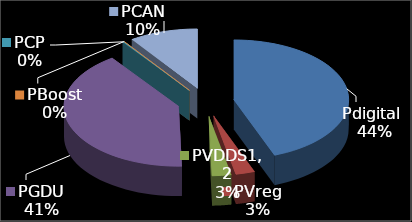
| Category | Series 0 |
|---|---|
| Pdigital  | 248.5 |
| PVreg | 15.05 |
| PVDDS1,2 | 15.05 |
| PGDU | 228.047 |
| PCP | 1.191 |
| PBoost | 0 |
| PCAN | 54.269 |